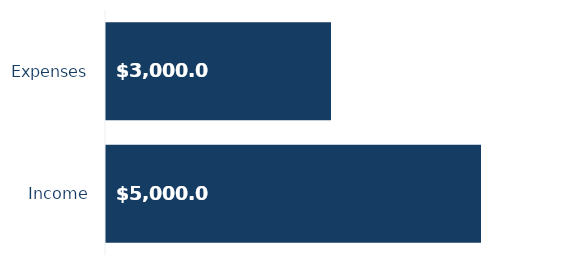
| Category | Income |
|---|---|
| Income | 5000 |
| Expenses | 3000 |